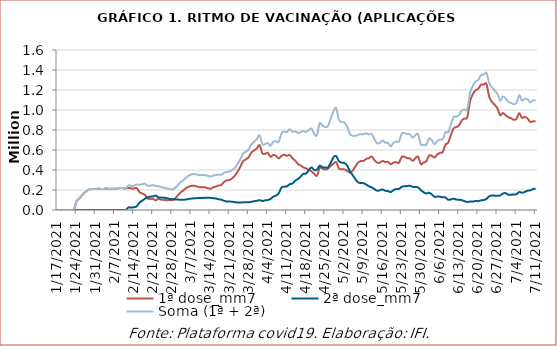
| Category | 1ª dose_mm7 | 2ª dose_mm7 | Soma (1ª + 2ª) |
|---|---|---|---|
| 1/17/21 | 0 | 0 | 0 |
| 1/18/21 | 0 | 0 | 0 |
| 1/19/21 | 0 | 0 | 0 |
| 1/20/21 | 0 | 0 | 0 |
| 1/21/21 | 0 | 0 | 0 |
| 1/22/21 | 0 | 0 | 0 |
| 1/23/21 | 0 | 0 | 0 |
| 1/24/21 | 87691.714 | 0 | 87691.714 |
| 1/25/21 | 114378.571 | 0 | 114378.571 |
| 1/26/21 | 147459.857 | 0 | 147459.857 |
| 1/27/21 | 174531.714 | 0 | 174531.714 |
| 1/28/21 | 195628.429 | 0 | 195628.429 |
| 1/29/21 | 208792 | 0 | 208792 |
| 1/30/21 | 210465 | 0 | 210465 |
| 1/31/21 | 210023.571 | 0 | 210023.571 |
| 2/1/21 | 212970.286 | 0 | 212970.286 |
| 2/2/21 | 210851.143 | 0 | 210851.143 |
| 2/3/21 | 210655.429 | 0 | 210655.429 |
| 2/4/21 | 215972.571 | 0 | 215972.571 |
| 2/5/21 | 210801.143 | 0 | 210801.143 |
| 2/6/21 | 212497.286 | 0 | 212497.286 |
| 2/7/21 | 213675.857 | 0 | 213675.857 |
| 2/8/21 | 213434.286 | 0 | 213434.286 |
| 2/9/21 | 221139 | 0 | 221139 |
| 2/10/21 | 217705.857 | 0 | 217705.857 |
| 2/11/21 | 215909.143 | 0 | 215909.143 |
| 2/12/21 | 221045.286 | 25215.143 | 246260.429 |
| 2/13/21 | 215529.857 | 24936.143 | 240466 |
| 2/14/21 | 213751.429 | 27454.429 | 241205.857 |
| 2/15/21 | 219675.143 | 36000.571 | 255675.714 |
| 2/16/21 | 179475.714 | 72411 | 251886.714 |
| 2/17/21 | 165264.286 | 91856.429 | 257120.714 |
| 2/18/21 | 150601.857 | 112115.286 | 262717.143 |
| 2/19/21 | 115660.429 | 125477 | 241137.429 |
| 2/20/21 | 110742.143 | 134094.857 | 244837 |
| 2/21/21 | 111567.143 | 136201 | 247768.143 |
| 2/22/21 | 96936.571 | 144081.143 | 241017.714 |
| 2/23/21 | 112867.857 | 125437.429 | 238305.286 |
| 2/24/21 | 102732.857 | 124741.429 | 227474.286 |
| 2/25/21 | 100898 | 122906.429 | 223804.429 |
| 2/26/21 | 97353.571 | 118199.857 | 215553.429 |
| 2/27/21 | 100102.857 | 111720.857 | 211823.714 |
| 2/28/21 | 97875.143 | 107417.286 | 205292.429 |
| 3/1/21 | 114774.286 | 105792.286 | 220566.571 |
| 3/2/21 | 142591 | 103929.857 | 246520.857 |
| 3/3/21 | 173685.286 | 103554.143 | 277239.429 |
| 3/4/21 | 193482.429 | 101856.571 | 295339 |
| 3/5/21 | 217300.429 | 104771 | 322071.429 |
| 3/6/21 | 231910.857 | 110534.857 | 342445.714 |
| 3/7/21 | 240780.714 | 113934.429 | 354715.143 |
| 3/8/21 | 242667.571 | 116827.714 | 359495.286 |
| 3/9/21 | 235761.143 | 118354.429 | 354115.571 |
| 3/10/21 | 227920.143 | 120855.143 | 348775.286 |
| 3/11/21 | 228195 | 120950.571 | 349145.571 |
| 3/12/21 | 226959.429 | 121780.286 | 348739.714 |
| 3/13/21 | 218280.429 | 123582.571 | 341863 |
| 3/14/21 | 212934 | 121102.429 | 334036.429 |
| 3/15/21 | 226117.286 | 117608.286 | 343725.571 |
| 3/16/21 | 233977.286 | 114974.571 | 348951.857 |
| 3/17/21 | 244597.286 | 107915.286 | 352512.571 |
| 3/18/21 | 251033.714 | 102455.286 | 353489 |
| 3/19/21 | 280263.714 | 91969 | 372232.714 |
| 3/20/21 | 295695 | 84299.143 | 379994.143 |
| 3/21/21 | 300039 | 84775.143 | 384814.143 |
| 3/22/21 | 318151.429 | 82352.714 | 400504.143 |
| 3/23/21 | 345060.571 | 77630.429 | 422691 |
| 3/24/21 | 387271.286 | 75313 | 462584.286 |
| 3/25/21 | 435312.429 | 74365.143 | 509677.571 |
| 3/26/21 | 488485.714 | 76439.571 | 564925.286 |
| 3/27/21 | 506042.286 | 76584 | 582626.286 |
| 3/28/21 | 527927.429 | 77297.571 | 605225 |
| 3/29/21 | 574347.429 | 81889.857 | 656237.286 |
| 3/30/21 | 596767.429 | 87891.714 | 684659.143 |
| 3/31/21 | 615622.714 | 91878.143 | 707500.857 |
| 4/1/21 | 648013.429 | 98480.857 | 746494.286 |
| 4/2/21 | 567419.429 | 90206.571 | 657626 |
| 4/3/21 | 562887.714 | 96169.143 | 659056.857 |
| 4/4/21 | 570908.429 | 99624.429 | 670532.857 |
| 4/5/21 | 531573.857 | 110964.571 | 642538.429 |
| 4/6/21 | 550705.143 | 132974.571 | 683679.714 |
| 4/7/21 | 541821.714 | 144577.143 | 686398.857 |
| 4/8/21 | 515369.143 | 166494.143 | 681863.286 |
| 4/9/21 | 541781.143 | 224414.571 | 766195.714 |
| 4/10/21 | 553547.143 | 233480.571 | 787027.714 |
| 4/11/21 | 541509 | 236523.571 | 778032.571 |
| 4/12/21 | 550602.714 | 257667 | 808269.714 |
| 4/13/21 | 517574 | 265454.857 | 783028.857 |
| 4/14/21 | 493985.143 | 292344.714 | 786329.857 |
| 4/15/21 | 461654.571 | 309270.714 | 770925.286 |
| 4/16/21 | 445285.571 | 333124.429 | 778410 |
| 4/17/21 | 426854.714 | 361605 | 788459.714 |
| 4/18/21 | 415626.571 | 364408.857 | 780035.429 |
| 4/19/21 | 399530.286 | 399621 | 799151.286 |
| 4/20/21 | 387276.429 | 425937.857 | 813214.286 |
| 4/21/21 | 360239 | 399670.429 | 759909.429 |
| 4/22/21 | 344117.143 | 404559.857 | 748677 |
| 4/23/21 | 424800.143 | 443722.143 | 868522.286 |
| 4/24/21 | 413692.429 | 427887.143 | 841579.571 |
| 4/25/21 | 404459.286 | 425484.857 | 829944.143 |
| 4/26/21 | 413531.429 | 426000 | 839531.429 |
| 4/27/21 | 441692.857 | 469422.143 | 911115 |
| 4/28/21 | 461517.286 | 525918.429 | 987435.714 |
| 4/29/21 | 479525.714 | 539777.714 | 1019303.429 |
| 4/30/21 | 416126.714 | 487594.143 | 903720.857 |
| 5/1/21 | 407125.429 | 474101.286 | 881226.714 |
| 5/2/21 | 406129.571 | 469421.857 | 875551.429 |
| 5/3/21 | 391909 | 444680.286 | 836589.286 |
| 5/4/21 | 374321.143 | 388339.857 | 762661 |
| 5/5/21 | 391674.429 | 350671.286 | 742345.714 |
| 5/6/21 | 432499.714 | 310128.714 | 742628.429 |
| 5/7/21 | 473108.286 | 276701 | 749809.286 |
| 5/8/21 | 488929.857 | 269489.286 | 758419.143 |
| 5/9/21 | 490522 | 267836.714 | 758358.714 |
| 5/10/21 | 511558.429 | 254947 | 766505.429 |
| 5/11/21 | 518190.857 | 237066.571 | 755257.429 |
| 5/12/21 | 534798.286 | 226764.714 | 761563 |
| 5/13/21 | 499614.143 | 208868 | 708482.143 |
| 5/14/21 | 473136.714 | 193410 | 666546.714 |
| 5/15/21 | 473891.714 | 196992 | 670883.714 |
| 5/16/21 | 490665.143 | 205214.286 | 695879.429 |
| 5/17/21 | 479722.286 | 192530.429 | 672252.714 |
| 5/18/21 | 481202.143 | 188895.857 | 670098 |
| 5/19/21 | 457378.429 | 179217.143 | 636595.571 |
| 5/20/21 | 474461.571 | 198889.571 | 673351.143 |
| 5/21/21 | 476933.143 | 210072.857 | 687006 |
| 5/22/21 | 473054.286 | 211379.714 | 684434 |
| 5/23/21 | 531689.143 | 231673.857 | 763363 |
| 5/24/21 | 531969.857 | 237198.429 | 769168.286 |
| 5/25/21 | 519144.429 | 240135.571 | 759280 |
| 5/26/21 | 515648 | 242224 | 757872 |
| 5/27/21 | 491577 | 232149.571 | 723726.571 |
| 5/28/21 | 517908.286 | 230178.571 | 748086.857 |
| 5/29/21 | 531809.857 | 225657.857 | 757467.714 |
| 5/30/21 | 458632 | 197927.143 | 656559.143 |
| 5/31/21 | 474300.571 | 178104.857 | 652405.429 |
| 6/1/21 | 486670.857 | 164659.571 | 651330.429 |
| 6/2/21 | 543836.857 | 172867.429 | 716704.286 |
| 6/3/21 | 541528.857 | 155897.714 | 697426.571 |
| 6/4/21 | 525643.286 | 131856.286 | 657499.571 |
| 6/5/21 | 555247.571 | 134037 | 689284.571 |
| 6/6/21 | 571505.571 | 133747.857 | 705253.429 |
| 6/7/21 | 578990.857 | 127928 | 706918.857 |
| 6/8/21 | 652846.429 | 124612.857 | 777459.286 |
| 6/9/21 | 673641.571 | 102323.429 | 775965 |
| 6/10/21 | 750880.143 | 105921.143 | 856801.286 |
| 6/11/21 | 817405.286 | 112612.571 | 930017.857 |
| 6/12/21 | 828704.286 | 104337.571 | 933041.857 |
| 6/13/21 | 847396.143 | 103275.714 | 950671.857 |
| 6/14/21 | 896611 | 98140.286 | 994751.286 |
| 6/15/21 | 915404.571 | 87534.857 | 1002939.429 |
| 6/16/21 | 928709.429 | 80485.143 | 1009194.571 |
| 6/17/21 | 1087097.143 | 84046.429 | 1171143.571 |
| 6/18/21 | 1157160.286 | 84062.143 | 1241222.429 |
| 6/19/21 | 1195258.571 | 89052.143 | 1284310.714 |
| 6/20/21 | 1211723.571 | 88849.429 | 1300573 |
| 6/21/21 | 1252063.429 | 95936.286 | 1347999.714 |
| 6/22/21 | 1254033.857 | 100194.857 | 1354228.714 |
| 6/23/21 | 1260346.286 | 111190.571 | 1371536.857 |
| 6/24/21 | 1132316.714 | 136408 | 1268724.714 |
| 6/25/21 | 1081993.143 | 145692.857 | 1227686 |
| 6/26/21 | 1052189.857 | 143661.143 | 1195851 |
| 6/27/21 | 1017397.429 | 142834.714 | 1160232.143 |
| 6/28/21 | 948712.286 | 144764.143 | 1093476.429 |
| 6/29/21 | 970185.857 | 164765.571 | 1134951.429 |
| 6/30/21 | 947725.429 | 168407.571 | 1116133 |
| 7/1/21 | 928430.857 | 152604.429 | 1081035.286 |
| 7/2/21 | 918326.714 | 152393.429 | 1070720.143 |
| 7/3/21 | 901556.857 | 155480.571 | 1057037.429 |
| 7/4/21 | 912433.714 | 159133.571 | 1071567.286 |
| 7/5/21 | 968447.286 | 179472.571 | 1147919.857 |
| 7/6/21 | 921435 | 172820.714 | 1094255.714 |
| 7/7/21 | 931671.286 | 179477.571 | 1111148.857 |
| 7/8/21 | 916241.286 | 192510.571 | 1108751.857 |
| 7/9/21 | 881007.857 | 195976.429 | 1076984.286 |
| 7/10/21 | 886637.143 | 209123.857 | 1095761 |
| 7/11/21 | 885279.571 | 213316.714 | 1098596.286 |